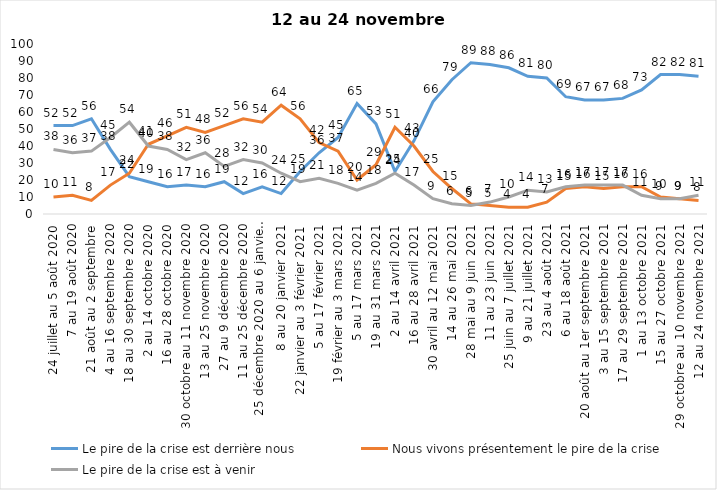
| Category | Le pire de la crise est derrière nous | Nous vivons présentement le pire de la crise | Le pire de la crise est à venir |
|---|---|---|---|
| 24 juillet au 5 août 2020 | 52 | 10 | 38 |
| 7 au 19 août 2020 | 52 | 11 | 36 |
| 21 août au 2 septembre | 56 | 8 | 37 |
| 4 au 16 septembre 2020 | 38 | 17 | 45 |
| 18 au 30 septembre 2020 | 22 | 24 | 54 |
| 2 au 14 octobre 2020 | 19 | 41 | 40 |
| 16 au 28 octobre 2020 | 16 | 46 | 38 |
| 30 octobre au 11 novembre 2020 | 17 | 51 | 32 |
| 13 au 25 novembre 2020 | 16 | 48 | 36 |
| 27 au 9 décembre 2020 | 19 | 52 | 28 |
| 11 au 25 décembre 2020 | 12 | 56 | 32 |
| 25 décembre 2020 au 6 janvier 2021 | 16 | 54 | 30 |
| 8 au 20 janvier 2021 | 12 | 64 | 24 |
| 22 janvier au 3 février 2021 | 25 | 56 | 19 |
| 5 au 17 février 2021 | 36 | 42 | 21 |
| 19 février au 3 mars 2021 | 45 | 37 | 18 |
| 5 au 17 mars 2021 | 65 | 20 | 14 |
| 19 au 31 mars 2021 | 53 | 29 | 18 |
| 2 au 14 avril 2021 | 25 | 51 | 24 |
| 16 au 28 avril 2021 | 43 | 40 | 17 |
| 30 avril au 12 mai 2021 | 66 | 25 | 9 |
| 14 au 26 mai 2021 | 79 | 15 | 6 |
| 28 mai au 9 juin 2021 | 89 | 6 | 5 |
| 11 au 23 juin 2021 | 88 | 5 | 7 |
| 25 juin au 7 juillet 2021 | 86 | 4 | 10 |
| 9 au 21 juillet 2021 | 81 | 4 | 14 |
| 23 au 4 août 2021 | 80 | 7 | 13 |
| 6 au 18 août 2021 | 69 | 15 | 16 |
| 20 août au 1er septembre 2021 | 67 | 16 | 17 |
| 3 au 15 septembre 2021 | 67 | 15 | 17 |
| 17 au 29 septembre 2021 | 68 | 16 | 17 |
| 1 au 13 octobre 2021 | 73 | 16 | 11 |
| 15 au 27 octobre 2021 | 82 | 10 | 9 |
| 29 octobre au 10 novembre 2021 | 82 | 9 | 9 |
| 12 au 24 novembre 2021 | 81 | 8 | 11 |